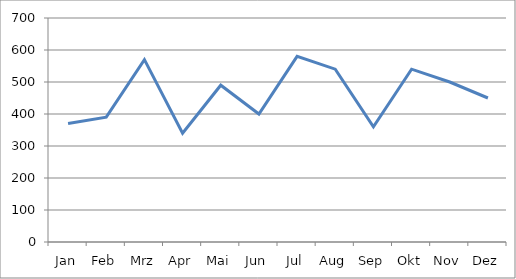
| Category | Produktion |
|---|---|
| Jan | 370 |
| Feb | 390 |
| Mrz | 570 |
| Apr | 340 |
| Mai | 490 |
| Jun | 400 |
| Jul | 580 |
| Aug | 540 |
| Sep | 360 |
| Okt | 540 |
| Nov | 500 |
| Dez | 450 |